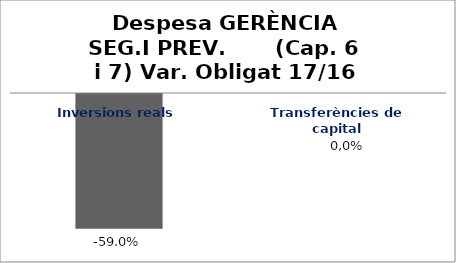
| Category | Series 0 |
|---|---|
| Inversions reals | -0.59 |
| Transferències de capital | 0 |